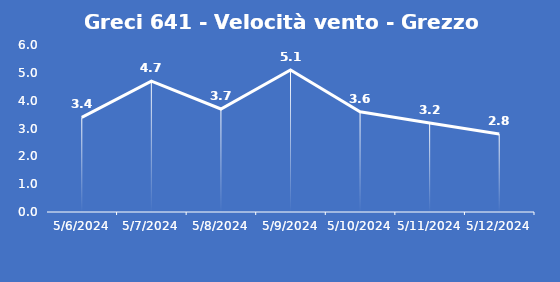
| Category | Greci 641 - Velocità vento - Grezzo (m/s) |
|---|---|
| 5/6/24 | 3.4 |
| 5/7/24 | 4.7 |
| 5/8/24 | 3.7 |
| 5/9/24 | 5.1 |
| 5/10/24 | 3.6 |
| 5/11/24 | 3.2 |
| 5/12/24 | 2.8 |